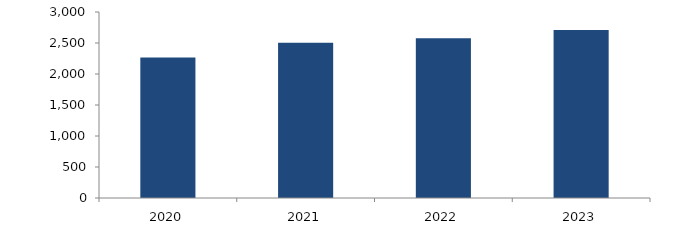
| Category | Bogotá |
|---|---|
| 2020.0 | 2267.12 |
| 2021.0 | 2504.673 |
| 2022.0 | 2577.026 |
| 2023.0 | 2709.091 |